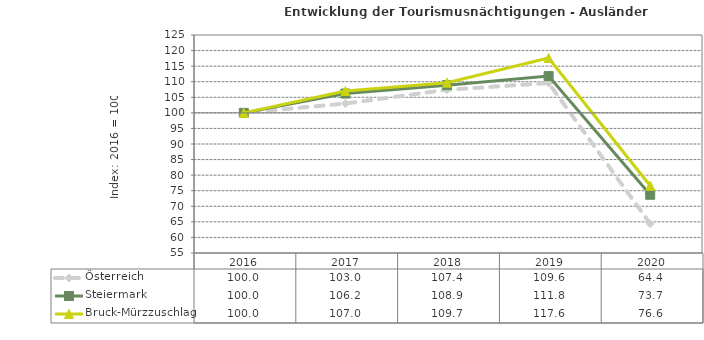
| Category | Österreich | Steiermark | Bruck-Mürzzuschlag |
|---|---|---|---|
| 2020.0 | 64.4 | 73.7 | 76.6 |
| 2019.0 | 109.6 | 111.8 | 117.6 |
| 2018.0 | 107.4 | 108.9 | 109.7 |
| 2017.0 | 103 | 106.2 | 107 |
| 2016.0 | 100 | 100 | 100 |